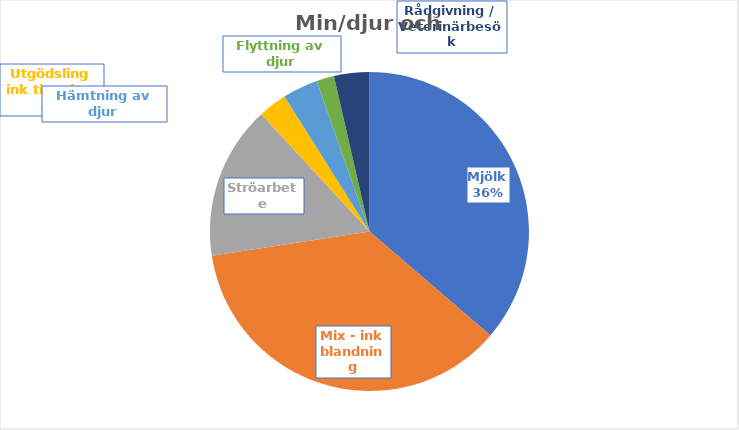
| Category | Min/djur och dag |
|---|---|
| Mjölk | 0.238 |
| Mix - ink blandning | 0.238 |
| Ströarbete | 0.102 |
| Utgödsling ink tippning | 0.019 |
| Hämtning av djur | 0.023 |
| Flyttning av djur | 0.012 |
| Rådgivning / Veterinärbesök | 0.023 |